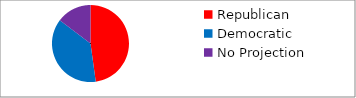
| Category | Series 0 |
|---|---|
| Republican | 208 |
| Democratic | 163 |
| No Projection | 64 |